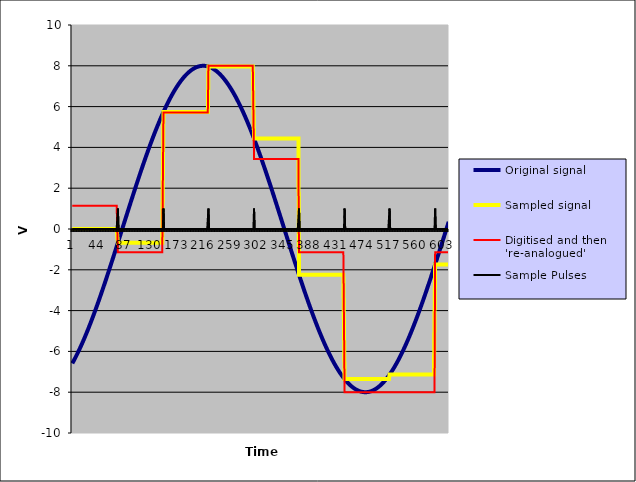
| Category | Original signal | Sampled signal | Digitised and then 're-analogued' | Sample Pulses |
|---|---|---|---|---|
| 0 | -6.587 | 0 | 1.143 | 0 |
| 1 | -6.532 | 0 | 1.143 | 0 |
| 2 | -6.476 | 0 | 1.143 | 0 |
| 3 | -6.42 | 0 | 1.143 | 0 |
| 4 | -6.362 | 0 | 1.143 | 0 |
| 5 | -6.304 | 0 | 1.143 | 0 |
| 6 | -6.245 | 0 | 1.143 | 0 |
| 7 | -6.185 | 0 | 1.143 | 0 |
| 8 | -6.124 | 0 | 1.143 | 0 |
| 9 | -6.062 | 0 | 1.143 | 0 |
| 10 | -5.999 | 0 | 1.143 | 0 |
| 11 | -5.935 | 0 | 1.143 | 0 |
| 12 | -5.871 | 0 | 1.143 | 0 |
| 13 | -5.806 | 0 | 1.143 | 0 |
| 14 | -5.74 | 0 | 1.143 | 0 |
| 15 | -5.673 | 0 | 1.143 | 0 |
| 16 | -5.605 | 0 | 1.143 | 0 |
| 17 | -5.536 | 0 | 1.143 | 0 |
| 18 | -5.467 | 0 | 1.143 | 0 |
| 19 | -5.397 | 0 | 1.143 | 0 |
| 20 | -5.326 | 0 | 1.143 | 0 |
| 21 | -5.254 | 0 | 1.143 | 0 |
| 22 | -5.182 | 0 | 1.143 | 0 |
| 23 | -5.109 | 0 | 1.143 | 0 |
| 24 | -5.035 | 0 | 1.143 | 0 |
| 25 | -4.96 | 0 | 1.143 | 0 |
| 26 | -4.885 | 0 | 1.143 | 0 |
| 27 | -4.809 | 0 | 1.143 | 0 |
| 28 | -4.732 | 0 | 1.143 | 0 |
| 29 | -4.655 | 0 | 1.143 | 0 |
| 30 | -4.577 | 0 | 1.143 | 0 |
| 31 | -4.498 | 0 | 1.143 | 0 |
| 32 | -4.419 | 0 | 1.143 | 0 |
| 33 | -4.339 | 0 | 1.143 | 0 |
| 34 | -4.259 | 0 | 1.143 | 0 |
| 35 | -4.178 | 0 | 1.143 | 0 |
| 36 | -4.096 | 0 | 1.143 | 0 |
| 37 | -4.014 | 0 | 1.143 | 0 |
| 38 | -3.931 | 0 | 1.143 | 0 |
| 39 | -3.847 | 0 | 1.143 | 0 |
| 40 | -3.763 | 0 | 1.143 | 0 |
| 41 | -3.679 | 0 | 1.143 | 0 |
| 42 | -3.594 | 0 | 1.143 | 0 |
| 43 | -3.508 | 0 | 1.143 | 0 |
| 44 | -3.422 | 0 | 1.143 | 0 |
| 45 | -3.335 | 0 | 1.143 | 0 |
| 46 | -3.248 | 0 | 1.143 | 0 |
| 47 | -3.161 | 0 | 1.143 | 0 |
| 48 | -3.073 | 0 | 1.143 | 0 |
| 49 | -2.984 | 0 | 1.143 | 0 |
| 50 | -2.896 | 0 | 1.143 | 0 |
| 51 | -2.806 | 0 | 1.143 | 0 |
| 52 | -2.717 | 0 | 1.143 | 0 |
| 53 | -2.627 | 0 | 1.143 | 0 |
| 54 | -2.536 | 0 | 1.143 | 0 |
| 55 | -2.446 | 0 | 1.143 | 0 |
| 56 | -2.354 | 0 | 1.143 | 0 |
| 57 | -2.263 | 0 | 1.143 | 0 |
| 58 | -2.171 | 0 | 1.143 | 0 |
| 59 | -2.079 | 0 | 1.143 | 0 |
| 60 | -1.987 | 0 | 1.143 | 0 |
| 61 | -1.894 | 0 | 1.143 | 0 |
| 62 | -1.801 | 0 | 1.143 | 0 |
| 63 | -1.708 | 0 | 1.143 | 0 |
| 64 | -1.615 | 0 | 1.143 | 0 |
| 65 | -1.521 | 0 | 1.143 | 0 |
| 66 | -1.427 | 0 | 1.143 | 0 |
| 67 | -1.333 | 0 | 1.143 | 0 |
| 68 | -1.239 | 0 | 1.143 | 0 |
| 69 | -1.144 | 0 | 1.143 | 0 |
| 70 | -1.05 | 0 | 1.143 | 0 |
| 71 | -0.955 | 0 | 1.143 | 0 |
| 72 | -0.86 | 0 | 1.143 | 0 |
| 73 | -0.765 | 0 | 1.143 | 0 |
| 74 | -0.67 | -0.67 | -1.143 | 1 |
| 75 | -0.575 | -0.67 | -1.143 | 0 |
| 76 | -0.479 | -0.67 | -1.143 | 0 |
| 77 | -0.384 | -0.67 | -1.143 | 0 |
| 78 | -0.289 | -0.67 | -1.143 | 0 |
| 79 | -0.193 | -0.67 | -1.143 | 0 |
| 80 | -0.098 | -0.67 | -1.143 | 0 |
| 81 | -0.002 | -0.67 | -1.143 | 0 |
| 82 | 0.093 | -0.67 | -1.143 | 0 |
| 83 | 0.189 | -0.67 | -1.143 | 0 |
| 84 | 0.284 | -0.67 | -1.143 | 0 |
| 85 | 0.38 | -0.67 | -1.143 | 0 |
| 86 | 0.475 | -0.67 | -1.143 | 0 |
| 87 | 0.57 | -0.67 | -1.143 | 0 |
| 88 | 0.666 | -0.67 | -1.143 | 0 |
| 89 | 0.761 | -0.67 | -1.143 | 0 |
| 90 | 0.856 | -0.67 | -1.143 | 0 |
| 91 | 0.951 | -0.67 | -1.143 | 0 |
| 92 | 1.045 | -0.67 | -1.143 | 0 |
| 93 | 1.14 | -0.67 | -1.143 | 0 |
| 94 | 1.234 | -0.67 | -1.143 | 0 |
| 95 | 1.329 | -0.67 | -1.143 | 0 |
| 96 | 1.423 | -0.67 | -1.143 | 0 |
| 97 | 1.517 | -0.67 | -1.143 | 0 |
| 98 | 1.61 | -0.67 | -1.143 | 0 |
| 99 | 1.704 | -0.67 | -1.143 | 0 |
| 100 | 1.797 | -0.67 | -1.143 | 0 |
| 101 | 1.89 | -0.67 | -1.143 | 0 |
| 102 | 1.983 | -0.67 | -1.143 | 0 |
| 103 | 2.075 | -0.67 | -1.143 | 0 |
| 104 | 2.167 | -0.67 | -1.143 | 0 |
| 105 | 2.259 | -0.67 | -1.143 | 0 |
| 106 | 2.35 | -0.67 | -1.143 | 0 |
| 107 | 2.441 | -0.67 | -1.143 | 0 |
| 108 | 2.532 | -0.67 | -1.143 | 0 |
| 109 | 2.623 | -0.67 | -1.143 | 0 |
| 110 | 2.713 | -0.67 | -1.143 | 0 |
| 111 | 2.802 | -0.67 | -1.143 | 0 |
| 112 | 2.891 | -0.67 | -1.143 | 0 |
| 113 | 2.98 | -0.67 | -1.143 | 0 |
| 114 | 3.069 | -0.67 | -1.143 | 0 |
| 115 | 3.157 | -0.67 | -1.143 | 0 |
| 116 | 3.244 | -0.67 | -1.143 | 0 |
| 117 | 3.331 | -0.67 | -1.143 | 0 |
| 118 | 3.418 | -0.67 | -1.143 | 0 |
| 119 | 3.504 | -0.67 | -1.143 | 0 |
| 120 | 3.59 | -0.67 | -1.143 | 0 |
| 121 | 3.675 | -0.67 | -1.143 | 0 |
| 122 | 3.759 | -0.67 | -1.143 | 0 |
| 123 | 3.843 | -0.67 | -1.143 | 0 |
| 124 | 3.927 | -0.67 | -1.143 | 0 |
| 125 | 4.01 | -0.67 | -1.143 | 0 |
| 126 | 4.092 | -0.67 | -1.143 | 0 |
| 127 | 4.174 | -0.67 | -1.143 | 0 |
| 128 | 4.255 | -0.67 | -1.143 | 0 |
| 129 | 4.336 | -0.67 | -1.143 | 0 |
| 130 | 4.416 | -0.67 | -1.143 | 0 |
| 131 | 4.495 | -0.67 | -1.143 | 0 |
| 132 | 4.574 | -0.67 | -1.143 | 0 |
| 133 | 4.652 | -0.67 | -1.143 | 0 |
| 134 | 4.729 | -0.67 | -1.143 | 0 |
| 135 | 4.806 | -0.67 | -1.143 | 0 |
| 136 | 4.882 | -0.67 | -1.143 | 0 |
| 137 | 4.957 | -0.67 | -1.143 | 0 |
| 138 | 5.032 | -0.67 | -1.143 | 0 |
| 139 | 5.105 | -0.67 | -1.143 | 0 |
| 140 | 5.179 | -0.67 | -1.143 | 0 |
| 141 | 5.251 | -0.67 | -1.143 | 0 |
| 142 | 5.323 | -0.67 | -1.143 | 0 |
| 143 | 5.394 | -0.67 | -1.143 | 0 |
| 144 | 5.464 | -0.67 | -1.143 | 0 |
| 145 | 5.533 | -0.67 | -1.143 | 0 |
| 146 | 5.602 | -0.67 | -1.143 | 0 |
| 147 | 5.669 | -0.67 | -1.143 | 0 |
| 148 | 5.736 | 5.736 | 5.714 | 1 |
| 149 | 5.803 | 5.736 | 5.714 | 0 |
| 150 | 5.868 | 5.736 | 5.714 | 0 |
| 151 | 5.932 | 5.736 | 5.714 | 0 |
| 152 | 5.996 | 5.736 | 5.714 | 0 |
| 153 | 6.059 | 5.736 | 5.714 | 0 |
| 154 | 6.121 | 5.736 | 5.714 | 0 |
| 155 | 6.182 | 5.736 | 5.714 | 0 |
| 156 | 6.242 | 5.736 | 5.714 | 0 |
| 157 | 6.301 | 5.736 | 5.714 | 0 |
| 158 | 6.36 | 5.736 | 5.714 | 0 |
| 159 | 6.417 | 5.736 | 5.714 | 0 |
| 160 | 6.474 | 5.736 | 5.714 | 0 |
| 161 | 6.529 | 5.736 | 5.714 | 0 |
| 162 | 6.584 | 5.736 | 5.714 | 0 |
| 163 | 6.638 | 5.736 | 5.714 | 0 |
| 164 | 6.691 | 5.736 | 5.714 | 0 |
| 165 | 6.743 | 5.736 | 5.714 | 0 |
| 166 | 6.794 | 5.736 | 5.714 | 0 |
| 167 | 6.844 | 5.736 | 5.714 | 0 |
| 168 | 6.892 | 5.736 | 5.714 | 0 |
| 169 | 6.94 | 5.736 | 5.714 | 0 |
| 170 | 6.987 | 5.736 | 5.714 | 0 |
| 171 | 7.033 | 5.736 | 5.714 | 0 |
| 172 | 7.078 | 5.736 | 5.714 | 0 |
| 173 | 7.122 | 5.736 | 5.714 | 0 |
| 174 | 7.165 | 5.736 | 5.714 | 0 |
| 175 | 7.207 | 5.736 | 5.714 | 0 |
| 176 | 7.248 | 5.736 | 5.714 | 0 |
| 177 | 7.288 | 5.736 | 5.714 | 0 |
| 178 | 7.327 | 5.736 | 5.714 | 0 |
| 179 | 7.365 | 5.736 | 5.714 | 0 |
| 180 | 7.402 | 5.736 | 5.714 | 0 |
| 181 | 7.437 | 5.736 | 5.714 | 0 |
| 182 | 7.472 | 5.736 | 5.714 | 0 |
| 183 | 7.506 | 5.736 | 5.714 | 0 |
| 184 | 7.538 | 5.736 | 5.714 | 0 |
| 185 | 7.57 | 5.736 | 5.714 | 0 |
| 186 | 7.6 | 5.736 | 5.714 | 0 |
| 187 | 7.629 | 5.736 | 5.714 | 0 |
| 188 | 7.657 | 5.736 | 5.714 | 0 |
| 189 | 7.685 | 5.736 | 5.714 | 0 |
| 190 | 7.711 | 5.736 | 5.714 | 0 |
| 191 | 7.735 | 5.736 | 5.714 | 0 |
| 192 | 7.759 | 5.736 | 5.714 | 0 |
| 193 | 7.782 | 5.736 | 5.714 | 0 |
| 194 | 7.804 | 5.736 | 5.714 | 0 |
| 195 | 7.824 | 5.736 | 5.714 | 0 |
| 196 | 7.843 | 5.736 | 5.714 | 0 |
| 197 | 7.862 | 5.736 | 5.714 | 0 |
| 198 | 7.879 | 5.736 | 5.714 | 0 |
| 199 | 7.895 | 5.736 | 5.714 | 0 |
| 200 | 7.91 | 5.736 | 5.714 | 0 |
| 201 | 7.923 | 5.736 | 5.714 | 0 |
| 202 | 7.936 | 5.736 | 5.714 | 0 |
| 203 | 7.947 | 5.736 | 5.714 | 0 |
| 204 | 7.958 | 5.736 | 5.714 | 0 |
| 205 | 7.967 | 5.736 | 5.714 | 0 |
| 206 | 7.975 | 5.736 | 5.714 | 0 |
| 207 | 7.982 | 5.736 | 5.714 | 0 |
| 208 | 7.988 | 5.736 | 5.714 | 0 |
| 209 | 7.993 | 5.736 | 5.714 | 0 |
| 210 | 7.996 | 5.736 | 5.714 | 0 |
| 211 | 7.999 | 5.736 | 5.714 | 0 |
| 212 | 8 | 5.736 | 5.714 | 0 |
| 213 | 8 | 5.736 | 5.714 | 0 |
| 214 | 7.999 | 5.736 | 5.714 | 0 |
| 215 | 7.997 | 5.736 | 5.714 | 0 |
| 216 | 7.993 | 5.736 | 5.714 | 0 |
| 217 | 7.989 | 5.736 | 5.714 | 0 |
| 218 | 7.983 | 5.736 | 5.714 | 0 |
| 219 | 7.977 | 5.736 | 5.714 | 0 |
| 220 | 7.969 | 5.736 | 5.714 | 0 |
| 221 | 7.96 | 7.96 | 8 | 1 |
| 222 | 7.95 | 7.96 | 8 | 0 |
| 223 | 7.938 | 7.96 | 8 | 0 |
| 224 | 7.926 | 7.96 | 8 | 0 |
| 225 | 7.913 | 7.96 | 8 | 0 |
| 226 | 7.898 | 7.96 | 8 | 0 |
| 227 | 7.882 | 7.96 | 8 | 0 |
| 228 | 7.865 | 7.96 | 8 | 0 |
| 229 | 7.847 | 7.96 | 8 | 0 |
| 230 | 7.828 | 7.96 | 8 | 0 |
| 231 | 7.808 | 7.96 | 8 | 0 |
| 232 | 7.786 | 7.96 | 8 | 0 |
| 233 | 7.764 | 7.96 | 8 | 0 |
| 234 | 7.74 | 7.96 | 8 | 0 |
| 235 | 7.716 | 7.96 | 8 | 0 |
| 236 | 7.69 | 7.96 | 8 | 0 |
| 237 | 7.663 | 7.96 | 8 | 0 |
| 238 | 7.635 | 7.96 | 8 | 0 |
| 239 | 7.606 | 7.96 | 8 | 0 |
| 240 | 7.576 | 7.96 | 8 | 0 |
| 241 | 7.545 | 7.96 | 8 | 0 |
| 242 | 7.512 | 7.96 | 8 | 0 |
| 243 | 7.479 | 7.96 | 8 | 0 |
| 244 | 7.445 | 7.96 | 8 | 0 |
| 245 | 7.409 | 7.96 | 8 | 0 |
| 246 | 7.373 | 7.96 | 8 | 0 |
| 247 | 7.335 | 7.96 | 8 | 0 |
| 248 | 7.296 | 7.96 | 8 | 0 |
| 249 | 7.257 | 7.96 | 8 | 0 |
| 250 | 7.216 | 7.96 | 8 | 0 |
| 251 | 7.174 | 7.96 | 8 | 0 |
| 252 | 7.131 | 7.96 | 8 | 0 |
| 253 | 7.088 | 7.96 | 8 | 0 |
| 254 | 7.043 | 7.96 | 8 | 0 |
| 255 | 6.997 | 7.96 | 8 | 0 |
| 256 | 6.95 | 7.96 | 8 | 0 |
| 257 | 6.902 | 7.96 | 8 | 0 |
| 258 | 6.854 | 7.96 | 8 | 0 |
| 259 | 6.804 | 7.96 | 8 | 0 |
| 260 | 6.753 | 7.96 | 8 | 0 |
| 261 | 6.701 | 7.96 | 8 | 0 |
| 262 | 6.649 | 7.96 | 8 | 0 |
| 263 | 6.595 | 7.96 | 8 | 0 |
| 264 | 6.541 | 7.96 | 8 | 0 |
| 265 | 6.485 | 7.96 | 8 | 0 |
| 266 | 6.429 | 7.96 | 8 | 0 |
| 267 | 6.372 | 7.96 | 8 | 0 |
| 268 | 6.313 | 7.96 | 8 | 0 |
| 269 | 6.254 | 7.96 | 8 | 0 |
| 270 | 6.194 | 7.96 | 8 | 0 |
| 271 | 6.133 | 7.96 | 8 | 0 |
| 272 | 6.072 | 7.96 | 8 | 0 |
| 273 | 6.009 | 7.96 | 8 | 0 |
| 274 | 5.946 | 7.96 | 8 | 0 |
| 275 | 5.881 | 7.96 | 8 | 0 |
| 276 | 5.816 | 7.96 | 8 | 0 |
| 277 | 5.75 | 7.96 | 8 | 0 |
| 278 | 5.683 | 7.96 | 8 | 0 |
| 279 | 5.616 | 7.96 | 8 | 0 |
| 280 | 5.547 | 7.96 | 8 | 0 |
| 281 | 5.478 | 7.96 | 8 | 0 |
| 282 | 5.408 | 7.96 | 8 | 0 |
| 283 | 5.337 | 7.96 | 8 | 0 |
| 284 | 5.266 | 7.96 | 8 | 0 |
| 285 | 5.193 | 7.96 | 8 | 0 |
| 286 | 5.12 | 7.96 | 8 | 0 |
| 287 | 5.047 | 7.96 | 8 | 0 |
| 288 | 4.972 | 7.96 | 8 | 0 |
| 289 | 4.897 | 7.96 | 8 | 0 |
| 290 | 4.821 | 7.96 | 8 | 0 |
| 291 | 4.745 | 7.96 | 8 | 0 |
| 292 | 4.667 | 7.96 | 8 | 0 |
| 293 | 4.59 | 7.96 | 8 | 0 |
| 294 | 4.511 | 7.96 | 8 | 0 |
| 295 | 4.432 | 4.432 | 3.429 | 1 |
| 296 | 4.352 | 4.432 | 3.429 | 0 |
| 297 | 4.271 | 4.432 | 3.429 | 0 |
| 298 | 4.19 | 4.432 | 3.429 | 0 |
| 299 | 4.109 | 4.432 | 3.429 | 0 |
| 300 | 4.027 | 4.432 | 3.429 | 0 |
| 301 | 3.944 | 4.432 | 3.429 | 0 |
| 302 | 3.86 | 4.432 | 3.429 | 0 |
| 303 | 3.776 | 4.432 | 3.429 | 0 |
| 304 | 3.692 | 4.432 | 3.429 | 0 |
| 305 | 3.607 | 4.432 | 3.429 | 0 |
| 306 | 3.522 | 4.432 | 3.429 | 0 |
| 307 | 3.435 | 4.432 | 3.429 | 0 |
| 308 | 3.349 | 4.432 | 3.429 | 0 |
| 309 | 3.262 | 4.432 | 3.429 | 0 |
| 310 | 3.175 | 4.432 | 3.429 | 0 |
| 311 | 3.087 | 4.432 | 3.429 | 0 |
| 312 | 2.998 | 4.432 | 3.429 | 0 |
| 313 | 2.91 | 4.432 | 3.429 | 0 |
| 314 | 2.82 | 4.432 | 3.429 | 0 |
| 315 | 2.731 | 4.432 | 3.429 | 0 |
| 316 | 2.641 | 4.432 | 3.429 | 0 |
| 317 | 2.551 | 4.432 | 3.429 | 0 |
| 318 | 2.46 | 4.432 | 3.429 | 0 |
| 319 | 2.369 | 4.432 | 3.429 | 0 |
| 320 | 2.277 | 4.432 | 3.429 | 0 |
| 321 | 2.186 | 4.432 | 3.429 | 0 |
| 322 | 2.094 | 4.432 | 3.429 | 0 |
| 323 | 2.001 | 4.432 | 3.429 | 0 |
| 324 | 1.909 | 4.432 | 3.429 | 0 |
| 325 | 1.816 | 4.432 | 3.429 | 0 |
| 326 | 1.723 | 4.432 | 3.429 | 0 |
| 327 | 1.629 | 4.432 | 3.429 | 0 |
| 328 | 1.536 | 4.432 | 3.429 | 0 |
| 329 | 1.442 | 4.432 | 3.429 | 0 |
| 330 | 1.348 | 4.432 | 3.429 | 0 |
| 331 | 1.254 | 4.432 | 3.429 | 0 |
| 332 | 1.159 | 4.432 | 3.429 | 0 |
| 333 | 1.065 | 4.432 | 3.429 | 0 |
| 334 | 0.97 | 4.432 | 3.429 | 0 |
| 335 | 0.875 | 4.432 | 3.429 | 0 |
| 336 | 0.78 | 4.432 | 3.429 | 0 |
| 337 | 0.685 | 4.432 | 3.429 | 0 |
| 338 | 0.59 | 4.432 | 3.429 | 0 |
| 339 | 0.494 | 4.432 | 3.429 | 0 |
| 340 | 0.399 | 4.432 | 3.429 | 0 |
| 341 | 0.304 | 4.432 | 3.429 | 0 |
| 342 | 0.208 | 4.432 | 3.429 | 0 |
| 343 | 0.113 | 4.432 | 3.429 | 0 |
| 344 | 0.017 | 4.432 | 3.429 | 0 |
| 345 | -0.078 | 4.432 | 3.429 | 0 |
| 346 | -0.174 | 4.432 | 3.429 | 0 |
| 347 | -0.269 | 4.432 | 3.429 | 0 |
| 348 | -0.365 | 4.432 | 3.429 | 0 |
| 349 | -0.46 | 4.432 | 3.429 | 0 |
| 350 | -0.555 | 4.432 | 3.429 | 0 |
| 351 | -0.651 | 4.432 | 3.429 | 0 |
| 352 | -0.746 | 4.432 | 3.429 | 0 |
| 353 | -0.841 | 4.432 | 3.429 | 0 |
| 354 | -0.936 | 4.432 | 3.429 | 0 |
| 355 | -1.03 | 4.432 | 3.429 | 0 |
| 356 | -1.125 | 4.432 | 3.429 | 0 |
| 357 | -1.219 | 4.432 | 3.429 | 0 |
| 358 | -1.314 | 4.432 | 3.429 | 0 |
| 359 | -1.408 | 4.432 | 3.429 | 0 |
| 360 | -1.502 | 4.432 | 3.429 | 0 |
| 361 | -1.596 | 4.432 | 3.429 | 0 |
| 362 | -1.689 | 4.432 | 3.429 | 0 |
| 363 | -1.782 | 4.432 | 3.429 | 0 |
| 364 | -1.875 | 4.432 | 3.429 | 0 |
| 365 | -1.968 | 4.432 | 3.429 | 0 |
| 366 | -2.06 | 4.432 | 3.429 | 0 |
| 367 | -2.152 | 4.432 | 3.429 | 0 |
| 368 | -2.244 | -2.244 | -1.143 | 1 |
| 369 | -2.336 | -2.244 | -1.143 | 0 |
| 370 | -2.427 | -2.244 | -1.143 | 0 |
| 371 | -2.518 | -2.244 | -1.143 | 0 |
| 372 | -2.608 | -2.244 | -1.143 | 0 |
| 373 | -2.698 | -2.244 | -1.143 | 0 |
| 374 | -2.788 | -2.244 | -1.143 | 0 |
| 375 | -2.877 | -2.244 | -1.143 | 0 |
| 376 | -2.966 | -2.244 | -1.143 | 0 |
| 377 | -3.055 | -2.244 | -1.143 | 0 |
| 378 | -3.143 | -2.244 | -1.143 | 0 |
| 379 | -3.23 | -2.244 | -1.143 | 0 |
| 380 | -3.318 | -2.244 | -1.143 | 0 |
| 381 | -3.404 | -2.244 | -1.143 | 0 |
| 382 | -3.49 | -2.244 | -1.143 | 0 |
| 383 | -3.576 | -2.244 | -1.143 | 0 |
| 384 | -3.661 | -2.244 | -1.143 | 0 |
| 385 | -3.746 | -2.244 | -1.143 | 0 |
| 386 | -3.83 | -2.244 | -1.143 | 0 |
| 387 | -3.914 | -2.244 | -1.143 | 0 |
| 388 | -3.997 | -2.244 | -1.143 | 0 |
| 389 | -4.079 | -2.244 | -1.143 | 0 |
| 390 | -4.161 | -2.244 | -1.143 | 0 |
| 391 | -4.242 | -2.244 | -1.143 | 0 |
| 392 | -4.323 | -2.244 | -1.143 | 0 |
| 393 | -4.403 | -2.244 | -1.143 | 0 |
| 394 | -4.482 | -2.244 | -1.143 | 0 |
| 395 | -4.561 | -2.244 | -1.143 | 0 |
| 396 | -4.639 | -2.244 | -1.143 | 0 |
| 397 | -4.717 | -2.244 | -1.143 | 0 |
| 398 | -4.794 | -2.244 | -1.143 | 0 |
| 399 | -4.87 | -2.244 | -1.143 | 0 |
| 400 | -4.945 | -2.244 | -1.143 | 0 |
| 401 | -5.02 | -2.244 | -1.143 | 0 |
| 402 | -5.094 | -2.244 | -1.143 | 0 |
| 403 | -5.167 | -2.244 | -1.143 | 0 |
| 404 | -5.24 | -2.244 | -1.143 | 0 |
| 405 | -5.311 | -2.244 | -1.143 | 0 |
| 406 | -5.382 | -2.244 | -1.143 | 0 |
| 407 | -5.453 | -2.244 | -1.143 | 0 |
| 408 | -5.522 | -2.244 | -1.143 | 0 |
| 409 | -5.591 | -2.244 | -1.143 | 0 |
| 410 | -5.659 | -2.244 | -1.143 | 0 |
| 411 | -5.726 | -2.244 | -1.143 | 0 |
| 412 | -5.792 | -2.244 | -1.143 | 0 |
| 413 | -5.858 | -2.244 | -1.143 | 0 |
| 414 | -5.922 | -2.244 | -1.143 | 0 |
| 415 | -5.986 | -2.244 | -1.143 | 0 |
| 416 | -6.049 | -2.244 | -1.143 | 0 |
| 417 | -6.111 | -2.244 | -1.143 | 0 |
| 418 | -6.172 | -2.244 | -1.143 | 0 |
| 419 | -6.233 | -2.244 | -1.143 | 0 |
| 420 | -6.292 | -2.244 | -1.143 | 0 |
| 421 | -6.351 | -2.244 | -1.143 | 0 |
| 422 | -6.408 | -2.244 | -1.143 | 0 |
| 423 | -6.465 | -2.244 | -1.143 | 0 |
| 424 | -6.521 | -2.244 | -1.143 | 0 |
| 425 | -6.576 | -2.244 | -1.143 | 0 |
| 426 | -6.63 | -2.244 | -1.143 | 0 |
| 427 | -6.682 | -2.244 | -1.143 | 0 |
| 428 | -6.735 | -2.244 | -1.143 | 0 |
| 429 | -6.786 | -2.244 | -1.143 | 0 |
| 430 | -6.836 | -2.244 | -1.143 | 0 |
| 431 | -6.885 | -2.244 | -1.143 | 0 |
| 432 | -6.933 | -2.244 | -1.143 | 0 |
| 433 | -6.98 | -2.244 | -1.143 | 0 |
| 434 | -7.026 | -2.244 | -1.143 | 0 |
| 435 | -7.071 | -2.244 | -1.143 | 0 |
| 436 | -7.116 | -2.244 | -1.143 | 0 |
| 437 | -7.159 | -2.244 | -1.143 | 0 |
| 438 | -7.201 | -2.244 | -1.143 | 0 |
| 439 | -7.242 | -2.244 | -1.143 | 0 |
| 440 | -7.282 | -2.244 | -1.143 | 0 |
| 441 | -7.321 | -2.244 | -1.143 | 0 |
| 442 | -7.359 | -7.359 | -8 | 1 |
| 443 | -7.396 | -7.359 | -8 | 0 |
| 444 | -7.432 | -7.359 | -8 | 0 |
| 445 | -7.467 | -7.359 | -8 | 0 |
| 446 | -7.5 | -7.359 | -8 | 0 |
| 447 | -7.533 | -7.359 | -8 | 0 |
| 448 | -7.565 | -7.359 | -8 | 0 |
| 449 | -7.595 | -7.359 | -8 | 0 |
| 450 | -7.625 | -7.359 | -8 | 0 |
| 451 | -7.653 | -7.359 | -8 | 0 |
| 452 | -7.68 | -7.359 | -8 | 0 |
| 453 | -7.707 | -7.359 | -8 | 0 |
| 454 | -7.732 | -7.359 | -8 | 0 |
| 455 | -7.756 | -7.359 | -8 | 0 |
| 456 | -7.778 | -7.359 | -8 | 0 |
| 457 | -7.8 | -7.359 | -8 | 0 |
| 458 | -7.821 | -7.359 | -8 | 0 |
| 459 | -7.84 | -7.359 | -8 | 0 |
| 460 | -7.859 | -7.359 | -8 | 0 |
| 461 | -7.876 | -7.359 | -8 | 0 |
| 462 | -7.892 | -7.359 | -8 | 0 |
| 463 | -7.907 | -7.359 | -8 | 0 |
| 464 | -7.921 | -7.359 | -8 | 0 |
| 465 | -7.934 | -7.359 | -8 | 0 |
| 466 | -7.946 | -7.359 | -8 | 0 |
| 467 | -7.956 | -7.359 | -8 | 0 |
| 468 | -7.966 | -7.359 | -8 | 0 |
| 469 | -7.974 | -7.359 | -8 | 0 |
| 470 | -7.981 | -7.359 | -8 | 0 |
| 471 | -7.987 | -7.359 | -8 | 0 |
| 472 | -7.992 | -7.359 | -8 | 0 |
| 473 | -7.996 | -7.359 | -8 | 0 |
| 474 | -7.998 | -7.359 | -8 | 0 |
| 475 | -8 | -7.359 | -8 | 0 |
| 476 | -8 | -7.359 | -8 | 0 |
| 477 | -7.999 | -7.359 | -8 | 0 |
| 478 | -7.997 | -7.359 | -8 | 0 |
| 479 | -7.994 | -7.359 | -8 | 0 |
| 480 | -7.99 | -7.359 | -8 | 0 |
| 481 | -7.984 | -7.359 | -8 | 0 |
| 482 | -7.978 | -7.359 | -8 | 0 |
| 483 | -7.97 | -7.359 | -8 | 0 |
| 484 | -7.961 | -7.359 | -8 | 0 |
| 485 | -7.951 | -7.359 | -8 | 0 |
| 486 | -7.94 | -7.359 | -8 | 0 |
| 487 | -7.928 | -7.359 | -8 | 0 |
| 488 | -7.915 | -7.359 | -8 | 0 |
| 489 | -7.9 | -7.359 | -8 | 0 |
| 490 | -7.885 | -7.359 | -8 | 0 |
| 491 | -7.868 | -7.359 | -8 | 0 |
| 492 | -7.85 | -7.359 | -8 | 0 |
| 493 | -7.831 | -7.359 | -8 | 0 |
| 494 | -7.811 | -7.359 | -8 | 0 |
| 495 | -7.79 | -7.359 | -8 | 0 |
| 496 | -7.768 | -7.359 | -8 | 0 |
| 497 | -7.744 | -7.359 | -8 | 0 |
| 498 | -7.72 | -7.359 | -8 | 0 |
| 499 | -7.694 | -7.359 | -8 | 0 |
| 500 | -7.667 | -7.359 | -8 | 0 |
| 501 | -7.64 | -7.359 | -8 | 0 |
| 502 | -7.611 | -7.359 | -8 | 0 |
| 503 | -7.581 | -7.359 | -8 | 0 |
| 504 | -7.55 | -7.359 | -8 | 0 |
| 505 | -7.518 | -7.359 | -8 | 0 |
| 506 | -7.484 | -7.359 | -8 | 0 |
| 507 | -7.45 | -7.359 | -8 | 0 |
| 508 | -7.415 | -7.359 | -8 | 0 |
| 509 | -7.378 | -7.359 | -8 | 0 |
| 510 | -7.341 | -7.359 | -8 | 0 |
| 511 | -7.302 | -7.359 | -8 | 0 |
| 512 | -7.263 | -7.359 | -8 | 0 |
| 513 | -7.222 | -7.359 | -8 | 0 |
| 514 | -7.181 | -7.359 | -8 | 0 |
| 515 | -7.138 | -7.138 | -8 | 1 |
| 516 | -7.095 | -7.138 | -8 | 0 |
| 517 | -7.05 | -7.138 | -8 | 0 |
| 518 | -7.004 | -7.138 | -8 | 0 |
| 519 | -6.958 | -7.138 | -8 | 0 |
| 520 | -6.91 | -7.138 | -8 | 0 |
| 521 | -6.861 | -7.138 | -8 | 0 |
| 522 | -6.812 | -7.138 | -8 | 0 |
| 523 | -6.761 | -7.138 | -8 | 0 |
| 524 | -6.71 | -7.138 | -8 | 0 |
| 525 | -6.657 | -7.138 | -8 | 0 |
| 526 | -6.604 | -7.138 | -8 | 0 |
| 527 | -6.549 | -7.138 | -8 | 0 |
| 528 | -6.494 | -7.138 | -8 | 0 |
| 529 | -6.438 | -7.138 | -8 | 0 |
| 530 | -6.381 | -7.138 | -8 | 0 |
| 531 | -6.323 | -7.138 | -8 | 0 |
| 532 | -6.264 | -7.138 | -8 | 0 |
| 533 | -6.204 | -7.138 | -8 | 0 |
| 534 | -6.143 | -7.138 | -8 | 0 |
| 535 | -6.081 | -7.138 | -8 | 0 |
| 536 | -6.019 | -7.138 | -8 | 0 |
| 537 | -5.956 | -7.138 | -8 | 0 |
| 538 | -5.891 | -7.138 | -8 | 0 |
| 539 | -5.826 | -7.138 | -8 | 0 |
| 540 | -5.761 | -7.138 | -8 | 0 |
| 541 | -5.694 | -7.138 | -8 | 0 |
| 542 | -5.626 | -7.138 | -8 | 0 |
| 543 | -5.558 | -7.138 | -8 | 0 |
| 544 | -5.489 | -7.138 | -8 | 0 |
| 545 | -5.419 | -7.138 | -8 | 0 |
| 546 | -5.348 | -7.138 | -8 | 0 |
| 547 | -5.277 | -7.138 | -8 | 0 |
| 548 | -5.205 | -7.138 | -8 | 0 |
| 549 | -5.132 | -7.138 | -8 | 0 |
| 550 | -5.058 | -7.138 | -8 | 0 |
| 551 | -4.984 | -7.138 | -8 | 0 |
| 552 | -4.909 | -7.138 | -8 | 0 |
| 553 | -4.833 | -7.138 | -8 | 0 |
| 554 | -4.757 | -7.138 | -8 | 0 |
| 555 | -4.68 | -7.138 | -8 | 0 |
| 556 | -4.602 | -7.138 | -8 | 0 |
| 557 | -4.523 | -7.138 | -8 | 0 |
| 558 | -4.444 | -7.138 | -8 | 0 |
| 559 | -4.365 | -7.138 | -8 | 0 |
| 560 | -4.284 | -7.138 | -8 | 0 |
| 561 | -4.203 | -7.138 | -8 | 0 |
| 562 | -4.122 | -7.138 | -8 | 0 |
| 563 | -4.04 | -7.138 | -8 | 0 |
| 564 | -3.957 | -7.138 | -8 | 0 |
| 565 | -3.874 | -7.138 | -8 | 0 |
| 566 | -3.79 | -7.138 | -8 | 0 |
| 567 | -3.705 | -7.138 | -8 | 0 |
| 568 | -3.62 | -7.138 | -8 | 0 |
| 569 | -3.535 | -7.138 | -8 | 0 |
| 570 | -3.449 | -7.138 | -8 | 0 |
| 571 | -3.363 | -7.138 | -8 | 0 |
| 572 | -3.276 | -7.138 | -8 | 0 |
| 573 | -3.188 | -7.138 | -8 | 0 |
| 574 | -3.101 | -7.138 | -8 | 0 |
| 575 | -3.012 | -7.138 | -8 | 0 |
| 576 | -2.924 | -7.138 | -8 | 0 |
| 577 | -2.835 | -7.138 | -8 | 0 |
| 578 | -2.745 | -7.138 | -8 | 0 |
| 579 | -2.655 | -7.138 | -8 | 0 |
| 580 | -2.565 | -7.138 | -8 | 0 |
| 581 | -2.474 | -7.138 | -8 | 0 |
| 582 | -2.383 | -7.138 | -8 | 0 |
| 583 | -2.292 | -7.138 | -8 | 0 |
| 584 | -2.2 | -7.138 | -8 | 0 |
| 585 | -2.108 | -7.138 | -8 | 0 |
| 586 | -2.016 | -7.138 | -8 | 0 |
| 587 | -1.923 | -7.138 | -8 | 0 |
| 588 | -1.831 | -7.138 | -8 | 0 |
| 589 | -1.737 | -1.737 | -1.143 | 1 |
| 590 | -1.644 | -1.737 | -1.143 | 0 |
| 591 | -1.551 | -1.737 | -1.143 | 0 |
| 592 | -1.457 | -1.737 | -1.143 | 0 |
| 593 | -1.363 | -1.737 | -1.143 | 0 |
| 594 | -1.269 | -1.737 | -1.143 | 0 |
| 595 | -1.174 | -1.737 | -1.143 | 0 |
| 596 | -1.08 | -1.737 | -1.143 | 0 |
| 597 | -0.985 | -1.737 | -1.143 | 0 |
| 598 | -0.89 | -1.737 | -1.143 | 0 |
| 599 | -0.795 | -1.737 | -1.143 | 0 |
| 600 | -0.7 | -1.737 | -1.143 | 0 |
| 601 | -0.605 | -1.737 | -1.143 | 0 |
| 602 | -0.51 | -1.737 | -1.143 | 0 |
| 603 | -0.414 | -1.737 | -1.143 | 0 |
| 604 | -0.319 | -1.737 | -1.143 | 0 |
| 605 | -0.223 | -1.737 | -1.143 | 0 |
| 606 | -0.128 | -1.737 | -1.143 | 0 |
| 607 | -0.032 | -1.737 | -1.143 | 0 |
| 608 | 0.063 | -1.737 | -1.143 | 0 |
| 609 | 0.159 | -1.737 | -1.143 | 0 |
| 610 | 0.254 | -1.737 | -1.143 | 0 |
| 611 | 0.35 | -1.737 | -1.143 | 0 |